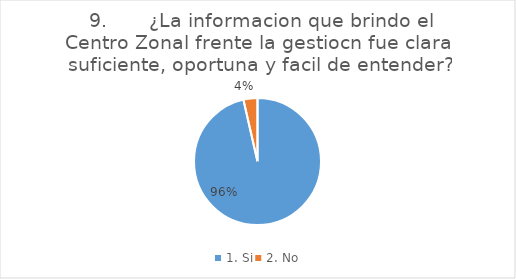
| Category | Series 0 |
|---|---|
| 1. Si | 27 |
| 2. No | 1 |